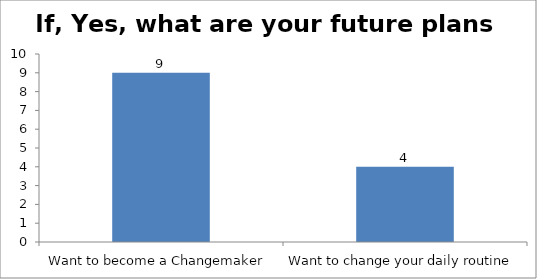
| Category | If, Yes, what are your future plans now? |
|---|---|
| Want to become a Changemaker | 9 |
| Want to change your daily routine | 4 |